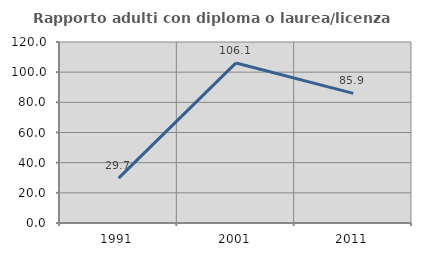
| Category | Rapporto adulti con diploma o laurea/licenza media  |
|---|---|
| 1991.0 | 29.73 |
| 2001.0 | 106.122 |
| 2011.0 | 85.915 |